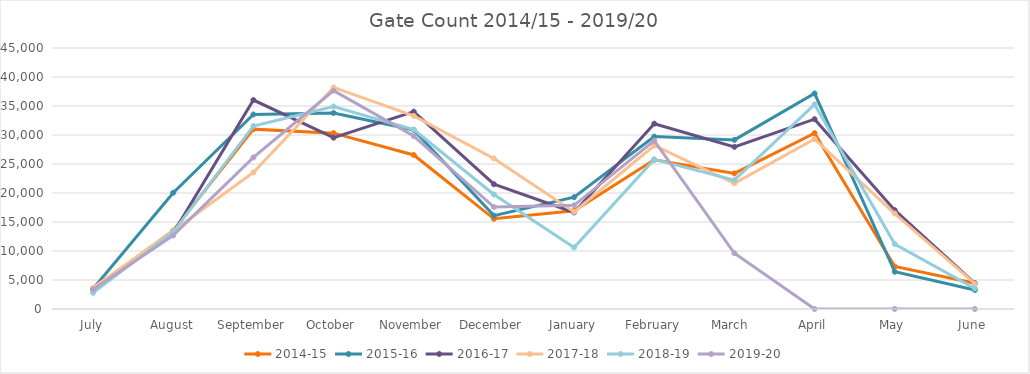
| Category | 2014-15 | 2015-16 | 2016-17 | 2017-18 | 2018-19 | 2019-20 |
|---|---|---|---|---|---|---|
| July | 3427 | 3506 | 3392 | 3653 | 2782 | 3363 |
| August | 13530 | 20050 | 13096 | 13479 | 13294 | 12682 |
| September | 31012 | 33538 | 36026 | 23551 | 31557 | 26129 |
| October | 30320 | 33791 | 29537 | 38209 | 34902 | 37649 |
| November | 26556 | 30869 | 34023 | 33287 | 30931 | 29822 |
| December | 15551 | 16096 | 21512 | 25951 | 19747 | 17581 |
| January | 16941 | 19271 | 16654 | 16743 | 10612 | 17872 |
| February | 25731 | 29730 | 31949 | 28193 | 25793 | 29043 |
| March  | 23376 | 29158 | 27959 | 21661 | 22209 | 9611 |
| April | 30320 | 37159 | 32727 | 29310 | 35279 | 0 |
| May | 7321 | 6424 | 17041 | 16462 | 11203 | 0 |
| June | 4453 | 3273 | 4431 | 4374 | 3544 | 0 |